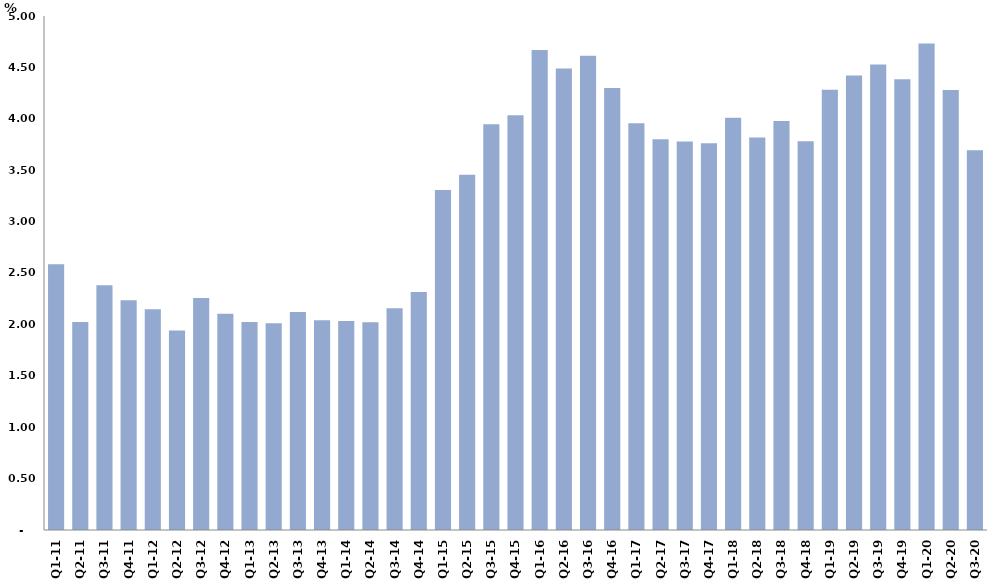
| Category | النسبة المئوية من الناتج المحلي الاجمالي
Percent of Total GDP |
|---|---|
| Q1-11 | 2.585 |
| Q2-11 | 2.024 |
| Q3-11 | 2.38 |
| Q4-11 | 2.236 |
| Q1-12 | 2.146 |
| Q2-12 | 1.94 |
| Q3-12 | 2.257 |
| Q4-12 | 2.104 |
| Q1-13 | 2.023 |
| Q2-13 | 2.01 |
| Q3-13 | 2.12 |
| Q4-13 | 2.04 |
| Q1-14 | 2.033 |
| Q2-14 | 2.021 |
| Q3-14 | 2.158 |
| Q4-14 | 2.315 |
| Q1-15 | 3.306 |
| Q2-15 | 3.457 |
| Q3-15 | 3.948 |
| Q4-15 | 4.034 |
| Q1-16 | 4.669 |
| Q2-16 | 4.49 |
| Q3-16 | 4.613 |
| Q4-16 | 4.299 |
| Q1-17 | 3.956 |
| Q2-17 | 3.802 |
| Q3-17 | 3.78 |
| Q4-17 | 3.762 |
| Q1-18 | 4.011 |
| Q2-18 | 3.818 |
| Q3-18 | 3.979 |
| Q4-18 | 3.781 |
| Q1-19 | 4.282 |
| Q2-19 | 4.42 |
| Q3-19 | 4.528 |
| Q4-19 | 4.384 |
| Q1-20 | 4.733 |
| Q2-20 | 4.28 |
| Q3-20 | 3.695 |